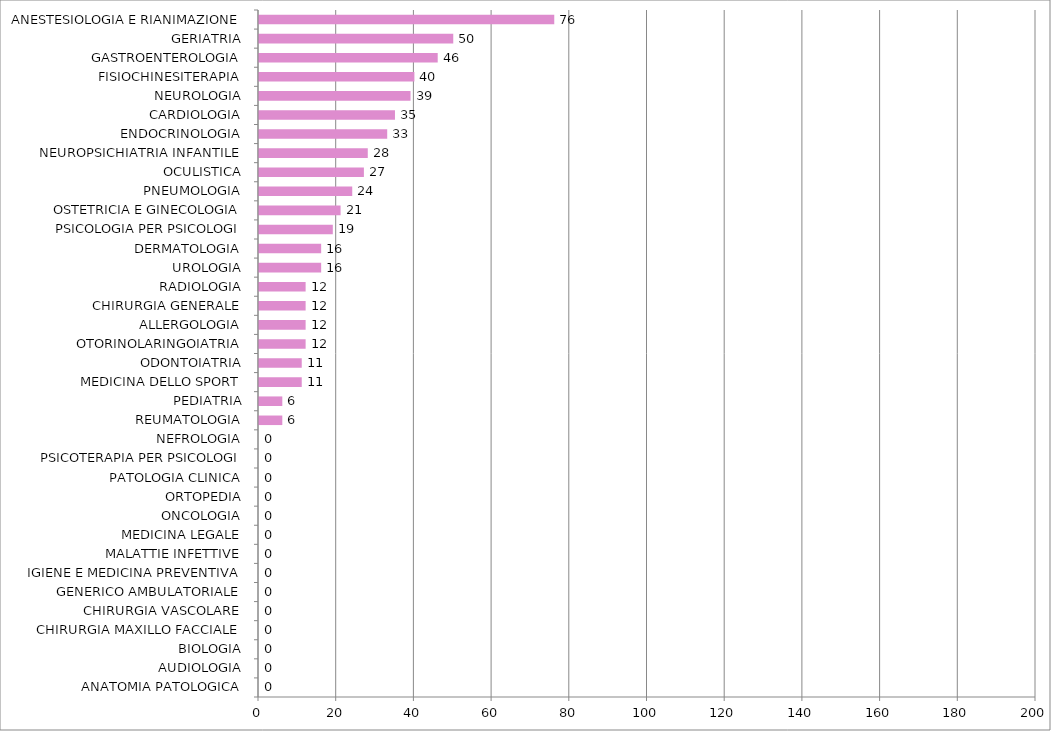
| Category | Series 0 |
|---|---|
| ANATOMIA PATOLOGICA | 0 |
| AUDIOLOGIA | 0 |
| BIOLOGIA | 0 |
| CHIRURGIA MAXILLO FACCIALE | 0 |
| CHIRURGIA VASCOLARE | 0 |
| GENERICO AMBULATORIALE | 0 |
| IGIENE E MEDICINA PREVENTIVA | 0 |
| MALATTIE INFETTIVE | 0 |
| MEDICINA LEGALE | 0 |
| ONCOLOGIA | 0 |
| ORTOPEDIA | 0 |
| PATOLOGIA CLINICA | 0 |
| PSICOTERAPIA PER PSICOLOGI | 0 |
| NEFROLOGIA | 0 |
| REUMATOLOGIA | 6 |
| PEDIATRIA | 6 |
| MEDICINA DELLO SPORT | 11 |
| ODONTOIATRIA | 11 |
| OTORINOLARINGOIATRIA | 12 |
| ALLERGOLOGIA | 12 |
| CHIRURGIA GENERALE | 12 |
| RADIOLOGIA | 12 |
| UROLOGIA | 16 |
| DERMATOLOGIA | 16 |
| PSICOLOGIA PER PSICOLOGI | 19 |
| OSTETRICIA E GINECOLOGIA | 21 |
| PNEUMOLOGIA | 24 |
| OCULISTICA | 27 |
| NEUROPSICHIATRIA INFANTILE | 28 |
| ENDOCRINOLOGIA | 33 |
| CARDIOLOGIA | 35 |
| NEUROLOGIA | 39 |
| FISIOCHINESITERAPIA | 40 |
| GASTROENTEROLOGIA | 46 |
| GERIATRIA | 50 |
| ANESTESIOLOGIA E RIANIMAZIONE | 76 |